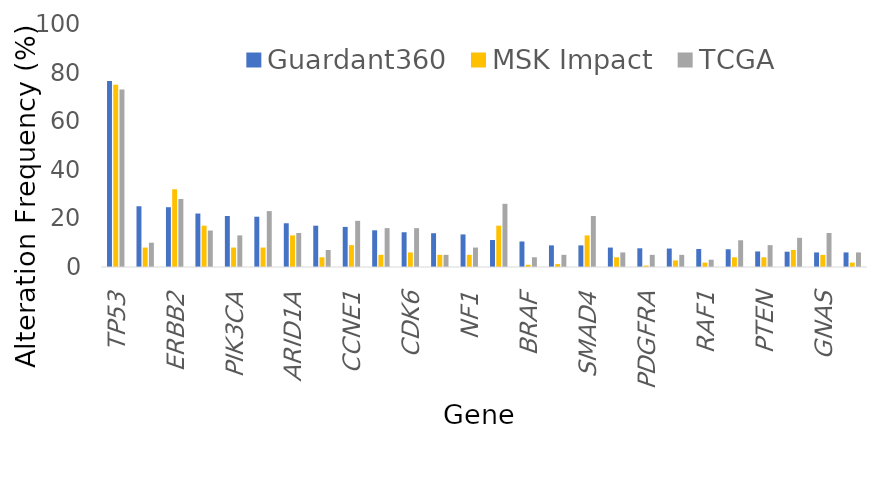
| Category | Guardant360 | MSK Impact | TCGA |
|---|---|---|---|
| TP53 | 76.5 | 75 | 73 |
| EGFR | 25 | 8 | 10 |
| ERBB2 | 24.6 | 32 | 28 |
| KRAS | 22 | 17 | 15 |
| PIK3CA | 21 | 8 | 13 |
| MYC | 20.7 | 8 | 23 |
| ARID1A | 18 | 13 | 14 |
| MET | 17 | 4 | 7 |
| CCNE1 | 16.5 | 9 | 19 |
| APC | 15.1 | 5 | 16 |
| CDK6 | 14.3 | 6 | 16 |
| FGFR2 | 13.9 | 5 | 5 |
| NF1 | 13.4 | 5 | 8 |
| CDKN2A | 11.1 | 17 | 26 |
| BRAF | 10.5 | 0.9 | 4 |
| FGFR1 | 8.9 | 1.2 | 5 |
| SMAD4 | 8.9 | 13 | 21 |
| AR | 8 | 4 | 6 |
| PDGFRA | 7.7 | 0.6 | 5 |
| KIT | 7.6 | 2.7 | 5 |
| RAF1 | 7.4 | 1.8 | 3 |
| BRCA2 | 7.3 | 4 | 11 |
| PTEN | 6.4 | 4 | 9 |
| CCND1 | 6.3 | 7 | 12 |
| GNAS | 6 | 5 | 14 |
| BRCA1 | 6 | 1.8 | 6 |